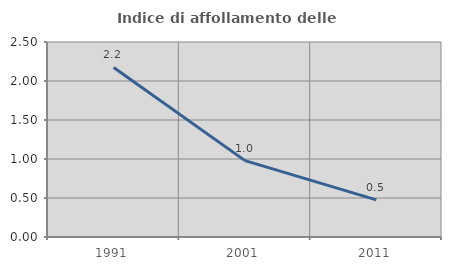
| Category | Indice di affollamento delle abitazioni  |
|---|---|
| 1991.0 | 2.174 |
| 2001.0 | 0.979 |
| 2011.0 | 0.477 |